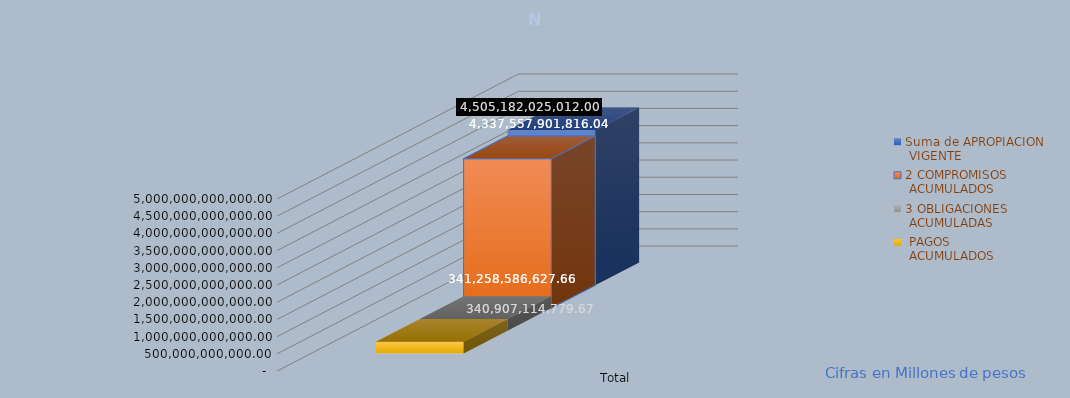
| Category | Suma de APROPIACION
 VIGENTE | 2 COMPROMISOS
 ACUMULADOS | 3 OBLIGACIONES
 ACUMULADAS |  PAGOS
 ACUMULADOS |
|---|---|---|---|---|
| Total | 4505182025012 | 4337557901816.04 | 341258586627.66 | 340907114779.67 |